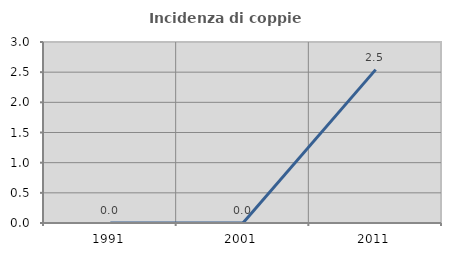
| Category | Incidenza di coppie miste |
|---|---|
| 1991.0 | 0 |
| 2001.0 | 0 |
| 2011.0 | 2.542 |